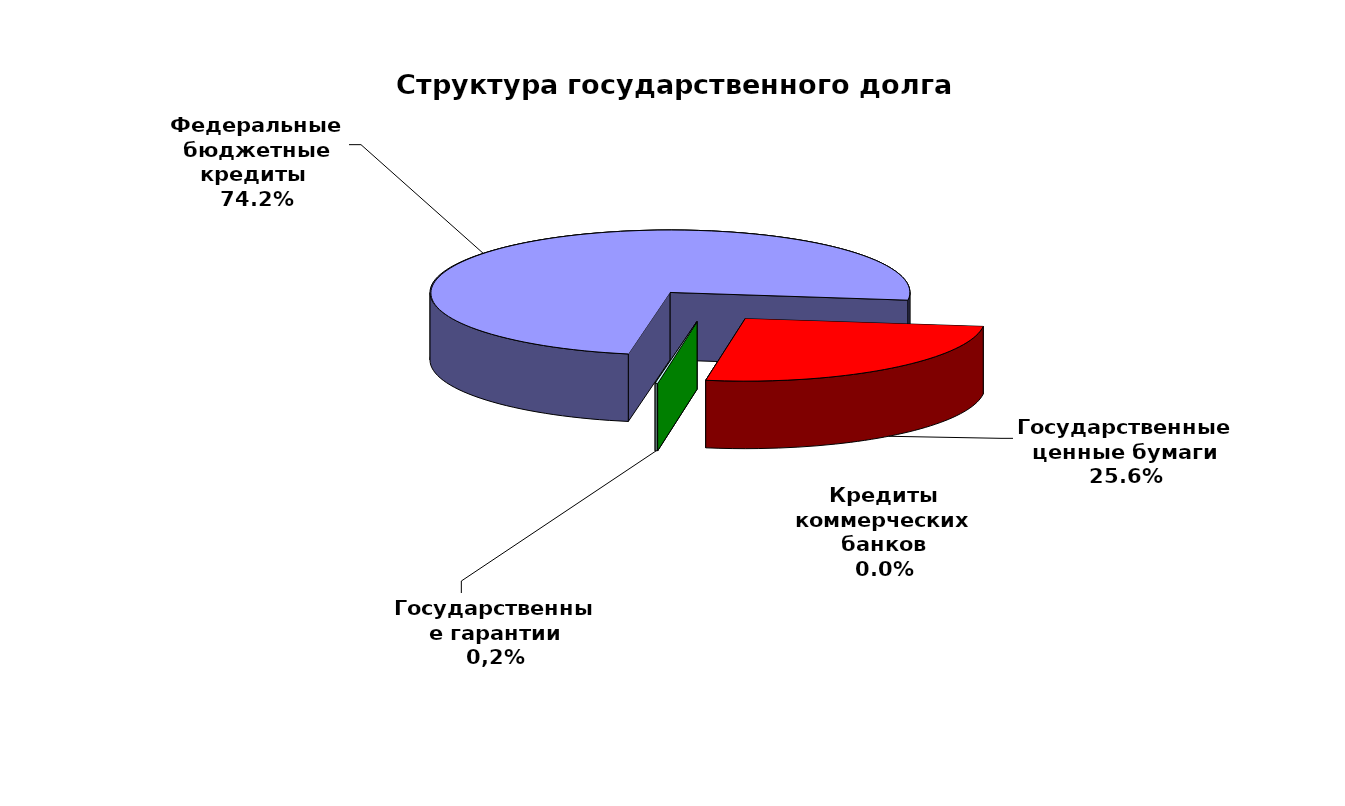
| Category | Series 0 |
|---|---|
| Федеральные бюджетные кредиты  | 98352839.324 |
| Государственные ценные бумаги | 34000000 |
| Кредиты коммерческих банков | 0 |
| Государственные гарантии | 202402.322 |